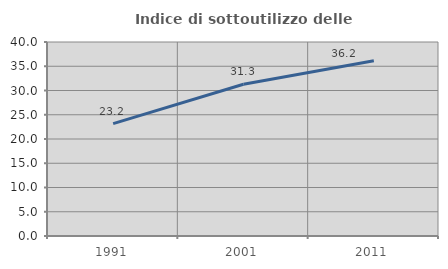
| Category | Indice di sottoutilizzo delle abitazioni  |
|---|---|
| 1991.0 | 23.181 |
| 2001.0 | 31.291 |
| 2011.0 | 36.154 |